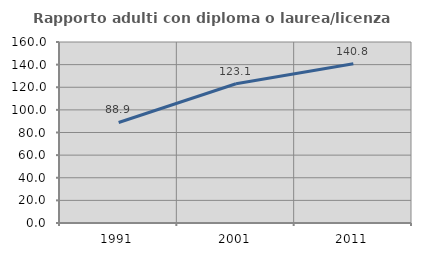
| Category | Rapporto adulti con diploma o laurea/licenza media  |
|---|---|
| 1991.0 | 88.874 |
| 2001.0 | 123.095 |
| 2011.0 | 140.816 |